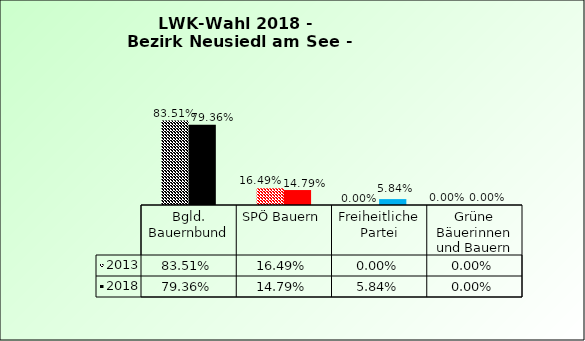
| Category | 2013 | 2018 |
|---|---|---|
| Bgld. Bauernbund | 0.835 | 0.794 |
| SPÖ Bauern | 0.165 | 0.148 |
| Freiheitliche Partei | 0 | 0.058 |
| Grüne Bäuerinnen und Bauern | 0 | 0 |